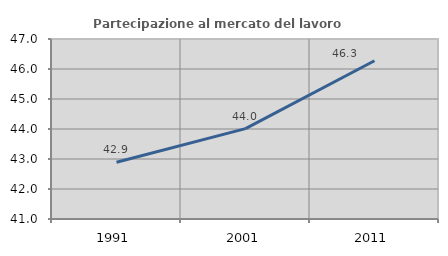
| Category | Partecipazione al mercato del lavoro  femminile |
|---|---|
| 1991.0 | 42.89 |
| 2001.0 | 44.011 |
| 2011.0 | 46.275 |